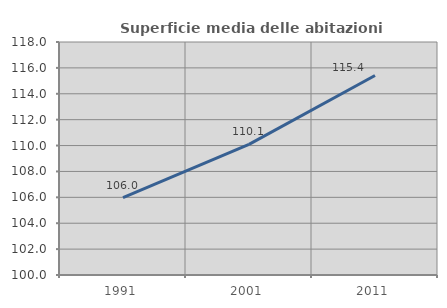
| Category | Superficie media delle abitazioni occupate |
|---|---|
| 1991.0 | 105.974 |
| 2001.0 | 110.093 |
| 2011.0 | 115.412 |